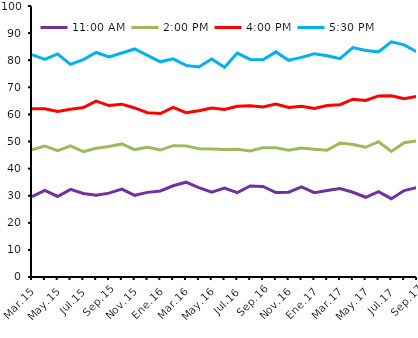
| Category | 11:00 AM | 2:00 PM | 4:00 PM | 5:30 PM |
|---|---|---|---|---|
| Mar.15 | 29.69 | 17.265 | 15.174 | 19.959 |
| Abr.15 | 31.93 | 16.36 | 13.783 | 18.241 |
| May.15 | 29.716 | 16.918 | 14.46 | 21.207 |
| Jun.15 | 32.328 | 16.096 | 13.452 | 16.606 |
| Jul.15 | 30.807 | 15.436 | 16.305 | 17.651 |
| Ago.15 | 30.183 | 17.308 | 17.421 | 17.925 |
| Sep.15 | 30.942 | 17.214 | 15.094 | 17.918 |
| Oct.15 | 32.431 | 16.675 | 14.676 | 18.855 |
| Nov.15 | 30.148 | 16.873 | 15.364 | 21.755 |
| Dic.15 | 31.224 | 16.657 | 12.726 | 21.192 |
| Ene.16 | 31.749 | 15.093 | 13.485 | 19.079 |
| Feb.16 | 33.67 | 14.792 | 14.141 | 17.894 |
| Mar.16 | 34.985 | 13.401 | 12.238 | 17.451 |
| Abr.16 | 32.953 | 14.387 | 13.987 | 16.149 |
| May.16 | 31.343 | 15.886 | 15.109 | 18.137 |
| Jun.16 | 32.815 | 14.245 | 14.792 | 15.547 |
| Jul.16 | 31.161 | 15.976 | 15.891 | 19.586 |
| Ago.16 | 33.611 | 12.896 | 16.689 | 17.082 |
| Sep.16 | 33.439 | 14.285 | 15.031 | 17.432 |
| Oct.16 | 31.184 | 16.519 | 16.091 | 19.277 |
| Nov.16 | 31.312 | 15.472 | 15.744 | 17.438 |
| Dic.16 | 33.297 | 14.296 | 15.445 | 17.998 |
| Ene.17 | 31.13 | 15.972 | 15.073 | 20.189 |
| Feb.17 | 31.924 | 14.883 | 16.445 | 18.41 |
| Mar.17 | 32.648 | 16.806 | 14.113 | 17.003 |
| Abr.17 | 31.279 | 17.62 | 16.719 | 19.063 |
| May.17 | 29.426 | 18.432 | 17.265 | 18.45 |
| Jun.17 | 31.506 | 18.419 | 16.911 | 16.249 |
| Jul.17 | 28.9 | 17.433 | 20.552 | 19.874 |
| Ago.17 | 31.882 | 17.684 | 16.188 | 19.905 |
| Sep.17 | 33.005 | 17.247 | 16.397 | 16.394 |